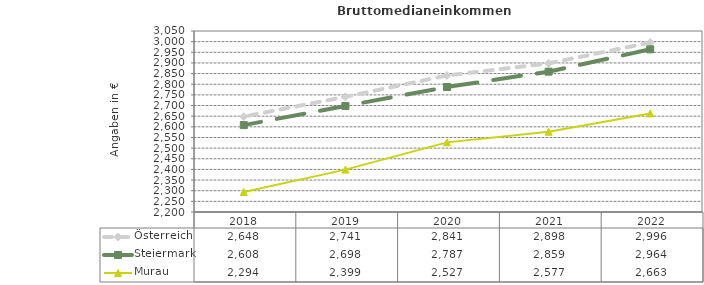
| Category | Österreich | Steiermark | Murau |
|---|---|---|---|
| 2022.0 | 2996 | 2964 | 2663 |
| 2021.0 | 2898 | 2859 | 2577 |
| 2020.0 | 2841 | 2787 | 2527 |
| 2019.0 | 2741 | 2698 | 2399 |
| 2018.0 | 2648 | 2608 | 2294 |